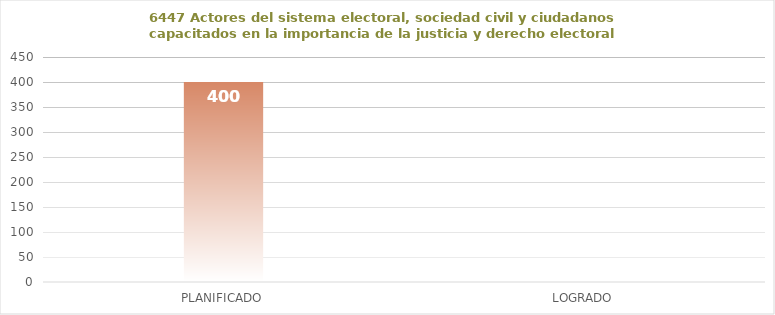
| Category | 6447 |
|---|---|
| PLANIFICADO | 400 |
| LOGRADO | 0 |